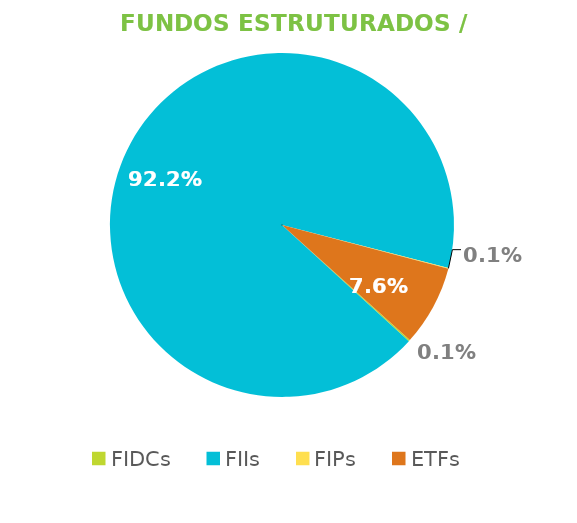
| Category | Fundos Estruturados / ETFs |
|---|---|
| FIDCs | 0.001 |
| FIIs | 0.922 |
| FIPs | 0.001 |
| ETFs | 0.076 |